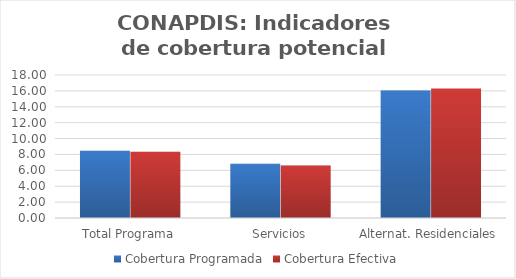
| Category | Cobertura Programada | Cobertura Efectiva |
|---|---|---|
| Total Programa | 8.472 | 8.333 |
| Servicios | 6.835 | 6.605 |
| Alternat. Residenciales | 16.035 | 16.315 |